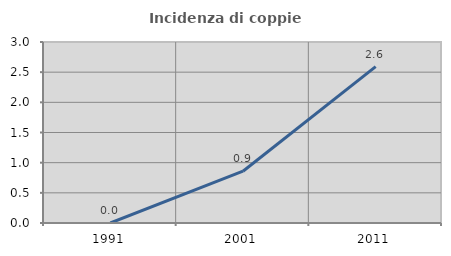
| Category | Incidenza di coppie miste |
|---|---|
| 1991.0 | 0 |
| 2001.0 | 0.858 |
| 2011.0 | 2.593 |